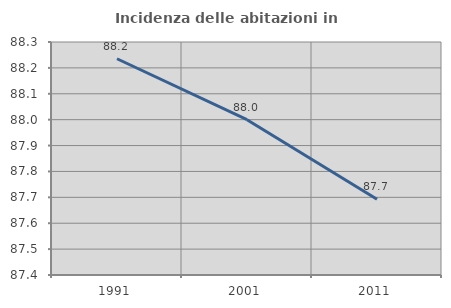
| Category | Incidenza delle abitazioni in proprietà  |
|---|---|
| 1991.0 | 88.235 |
| 2001.0 | 88 |
| 2011.0 | 87.692 |